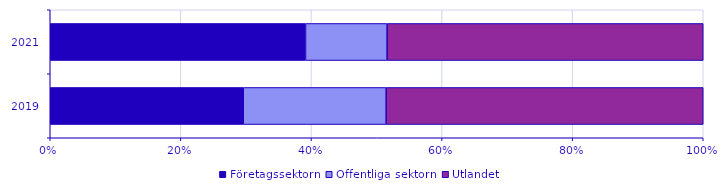
| Category | Företagssektorn | Offentliga sektorn | Utlandet |
|---|---|---|---|
| 2019 | 7560.537 | 5598.22 | 12420.657 |
| 2021 | 15002 | 4795 | 18580 |